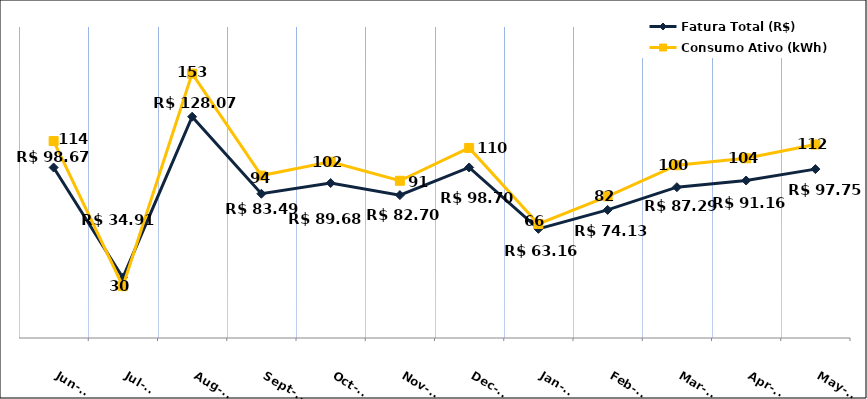
| Category | Fatura Total (R$) |
|---|---|
| 2023-06-01 | 98.67 |
| 2023-07-01 | 34.91 |
| 2023-08-01 | 128.07 |
| 2023-09-01 | 83.49 |
| 2023-10-01 | 89.68 |
| 2023-11-01 | 82.7 |
| 2023-12-01 | 98.7 |
| 2024-01-01 | 63.16 |
| 2024-02-01 | 74.13 |
| 2024-03-01 | 87.29 |
| 2024-04-01 | 91.16 |
| 2024-05-01 | 97.75 |